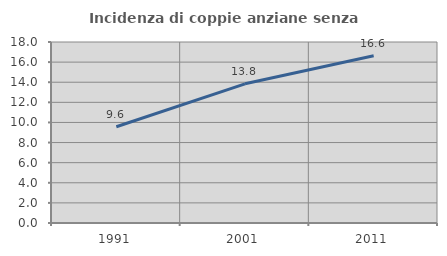
| Category | Incidenza di coppie anziane senza figli  |
|---|---|
| 1991.0 | 9.573 |
| 2001.0 | 13.842 |
| 2011.0 | 16.641 |